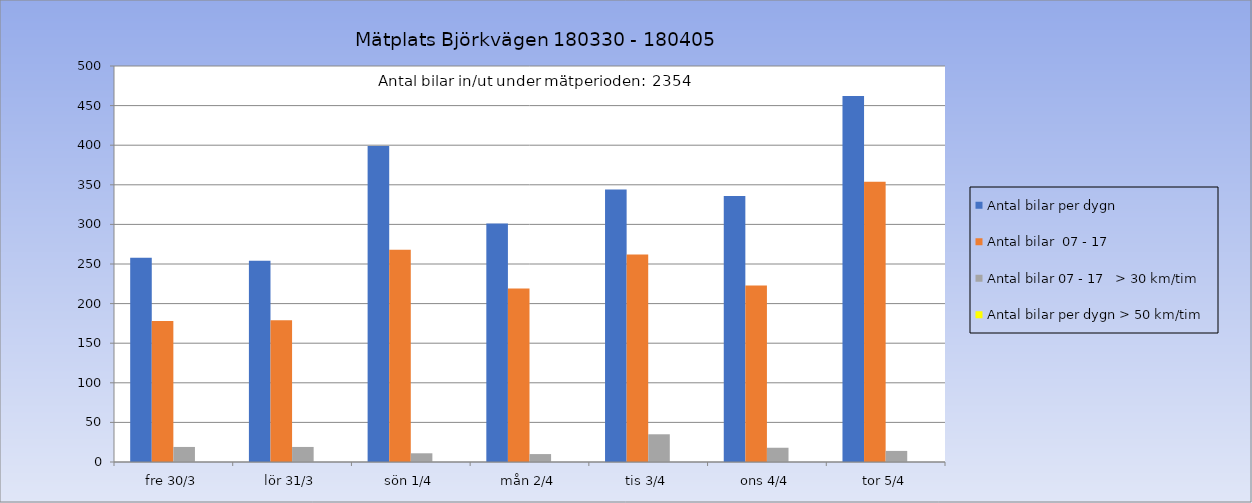
| Category | Antal bilar per dygn | Antal bilar  07 - 17 | Antal bilar 07 - 17   > 30 km/tim | Antal bilar per dygn > 50 km/tim |
|---|---|---|---|---|
| fre 30/3 | 258 | 178 | 19 | 0 |
| lör 31/3 | 254 | 179 | 19 | 0 |
| sön 1/4 | 399 | 268 | 11 | 0 |
| mån 2/4 | 301 | 219 | 10 | 0 |
| tis 3/4 | 344 | 262 | 35 | 0 |
| ons 4/4 | 336 | 223 | 18 | 0 |
| tor 5/4 | 462 | 354 | 14 | 0 |